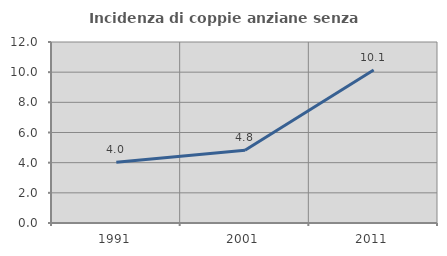
| Category | Incidenza di coppie anziane senza figli  |
|---|---|
| 1991.0 | 4.023 |
| 2001.0 | 4.825 |
| 2011.0 | 10.145 |